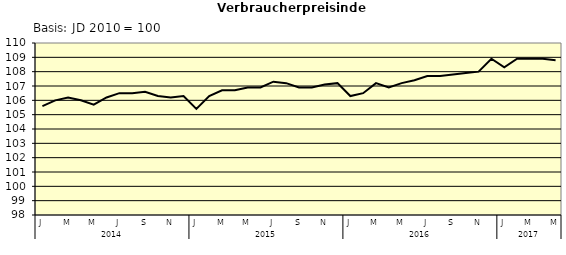
| Category | Series 0 |
|---|---|
| 0 | 105.6 |
| 1 | 106 |
| 2 | 106.2 |
| 3 | 106 |
| 4 | 105.7 |
| 5 | 106.2 |
| 6 | 106.5 |
| 7 | 106.5 |
| 8 | 106.6 |
| 9 | 106.3 |
| 10 | 106.2 |
| 11 | 106.3 |
| 12 | 105.4 |
| 13 | 106.3 |
| 14 | 106.7 |
| 15 | 106.7 |
| 16 | 106.9 |
| 17 | 106.9 |
| 18 | 107.3 |
| 19 | 107.2 |
| 20 | 106.9 |
| 21 | 106.9 |
| 22 | 107.1 |
| 23 | 107.2 |
| 24 | 106.3 |
| 25 | 106.5 |
| 26 | 107.2 |
| 27 | 106.9 |
| 28 | 107.2 |
| 29 | 107.4 |
| 30 | 107.7 |
| 31 | 107.7 |
| 32 | 107.8 |
| 33 | 107.9 |
| 34 | 108 |
| 35 | 108.9 |
| 36 | 108.3 |
| 37 | 108.9 |
| 38 | 108.9 |
| 39 | 108.9 |
| 40 | 108.8 |